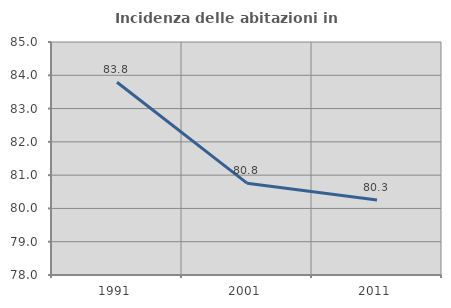
| Category | Incidenza delle abitazioni in proprietà  |
|---|---|
| 1991.0 | 83.791 |
| 2001.0 | 80.759 |
| 2011.0 | 80.256 |